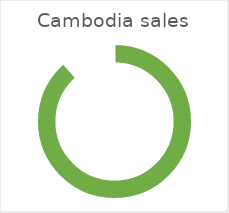
| Category | Total |
|---|---|
| Cambodia | 1310000 |
| Thailand | 170000 |